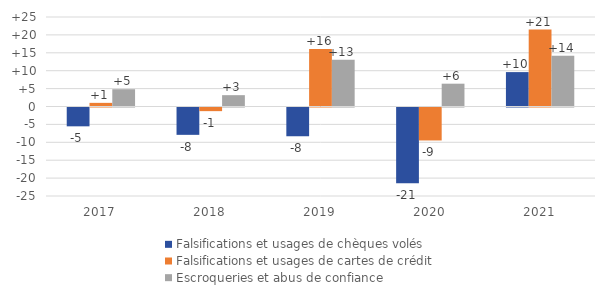
| Category | Falsifications et usages de chèques volés | Falsifications et usages de cartes de crédit | Escroqueries et abus de confiance |
|---|---|---|---|
| 2017.0 | -5.258 | 1.016 | 4.827 |
| 2018.0 | -7.638 | -1.018 | 3.167 |
| 2019.0 | -8.032 | 16.027 | 13.077 |
| 2020.0 | -21.131 | -9.209 | 6.37 |
| 2021.0 | 9.608 | 21.488 | 14.15 |